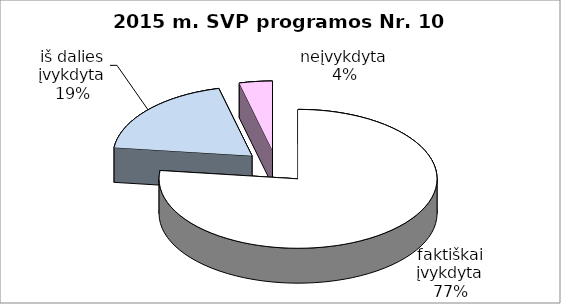
| Category | Series 0 |
|---|---|
| faktiškai įvykdyta | 20 |
| iš dalies įvykdyta | 5 |
| neįvykdyta | 1 |